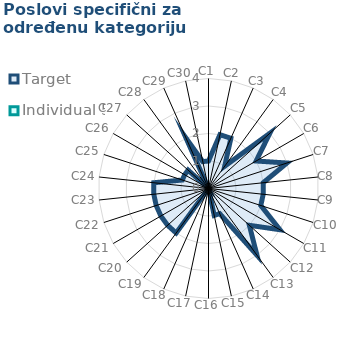
| Category | Target | Individual 5 |
|---|---|---|
| C1 | 1 | 0 |
| C2 | 2 | 0 |
| C3 | 2 | 0 |
| C4 | 1 | 0 |
| C5 | 3 | 0 |
| C6 | 2 | 0 |
| C7 | 3 | 0 |
| C8 | 2 | 0 |
| C9 | 2 | 0 |
| C10 | 2 | 0 |
| C11 | 3 | 0 |
| C12 | 2 | 0 |
| C13 | 3 | 0 |
| C14 | 1 | 0 |
| C15 | 1 | 0 |
| C16 | 0 | 0 |
| C17 | 0 | 0 |
| C18 | 0 | 0 |
| C19 | 2 | 0 |
| C20 | 2 | 0 |
| C21 | 2 | 0 |
| C22 | 2 | 0 |
| C23 | 2 | 0 |
| C24 | 2 | 0 |
| C25 | 1 | 0 |
| C26 | 1 | 0 |
| C27 | 1 | 0 |
| C28 | 0 | 0 |
| C29 | 2 | 0 |
| C30 | 1 | 0 |